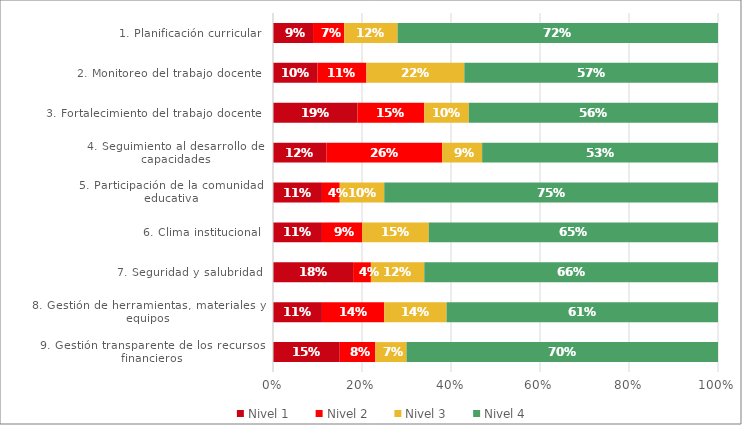
| Category | Nivel 1 | Nivel 2 | Nivel 3 | Nivel 4 |
|---|---|---|---|---|
| 1. Planificación curricular | 0.09 | 0.07 | 0.12 | 0.72 |
| 2. Monitoreo del trabajo docente | 0.1 | 0.11 | 0.22 | 0.57 |
| 3. Fortalecimiento del trabajo docente | 0.19 | 0.15 | 0.1 | 0.56 |
| 4. Seguimiento al desarrollo de capacidades | 0.12 | 0.26 | 0.09 | 0.53 |
| 5. Participación de la comunidad educativa | 0.11 | 0.04 | 0.1 | 0.75 |
| 6. Clima institucional | 0.11 | 0.09 | 0.15 | 0.65 |
| 7. Seguridad y salubridad | 0.18 | 0.04 | 0.12 | 0.66 |
| 8. Gestión de herramientas, materiales y equipos | 0.11 | 0.14 | 0.14 | 0.61 |
| 9. Gestión transparente de los recursos financieros | 0.15 | 0.08 | 0.07 | 0.7 |